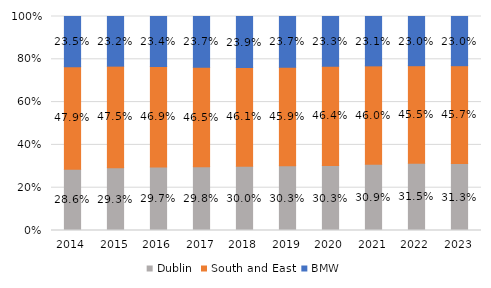
| Category | Dublin | South and East | BMW |
|---|---|---|---|
| 2014.0 | 0.286 | 0.479 | 0.235 |
| 2015.0 | 0.293 | 0.475 | 0.232 |
| 2016.0 | 0.297 | 0.469 | 0.234 |
| 2017.0 | 0.298 | 0.465 | 0.237 |
| 2018.0 | 0.3 | 0.461 | 0.239 |
| 2019.0 | 0.303 | 0.459 | 0.237 |
| 2020.0 | 0.303 | 0.464 | 0.233 |
| 2021.0 | 0.309 | 0.46 | 0.231 |
| 2022.0 | 0.315 | 0.455 | 0.23 |
| 2023.0 | 0.313 | 0.457 | 0.23 |